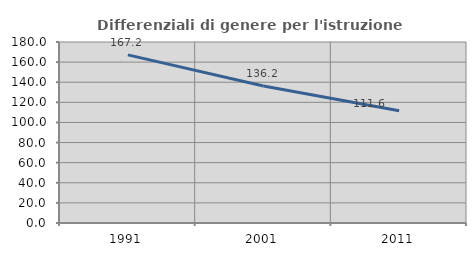
| Category | Differenziali di genere per l'istruzione superiore |
|---|---|
| 1991.0 | 167.173 |
| 2001.0 | 136.196 |
| 2011.0 | 111.594 |